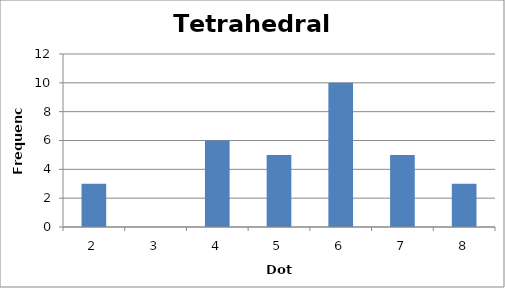
| Category | Series 0 |
|---|---|
| 2.0 | 3 |
| 3.0 | 0 |
| 4.0 | 6 |
| 5.0 | 5 |
| 6.0 | 10 |
| 7.0 | 5 |
| 8.0 | 3 |